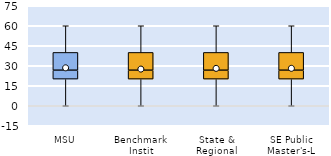
| Category | 25th | 50th | 75th |
|---|---|---|---|
| MSU | 20 | 6.667 | 13.333 |
| Benchmark Instit | 20 | 6.667 | 13.333 |
| State & Regional | 20 | 6.667 | 13.333 |
| SE Public Master's-L | 20 | 6.667 | 13.333 |